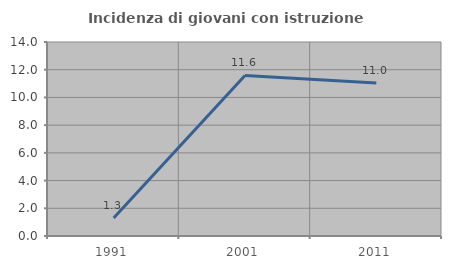
| Category | Incidenza di giovani con istruzione universitaria |
|---|---|
| 1991.0 | 1.299 |
| 2001.0 | 11.585 |
| 2011.0 | 11.047 |